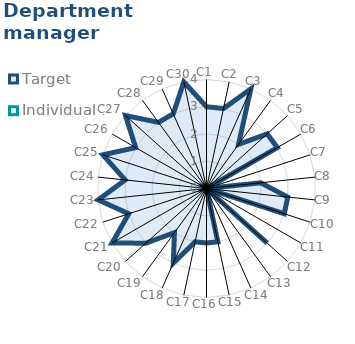
| Category | Target | Individual 1 |
|---|---|---|
| C1 | 3 | 0 |
| C2 | 3 | 0 |
| C3 | 4 | 0 |
| C4 | 2 | 0 |
| C5 | 3 | 0 |
| C6 | 3 | 0 |
| C7 | 0 | 0 |
| C8 | 2 | 0 |
| C9 | 3 | 0 |
| C10 | 3 | 0 |
| C11 | 0 | 0 |
| C12 | 3 | 0 |
| C13 | 0 | 0 |
| C14 | 0 | 0 |
| C15 | 2 | 0 |
| C16 | 2 | 0 |
| C17 | 2 | 0 |
| C18 | 3 | 0 |
| C19 | 2 | 0 |
| C20 | 3 | 0 |
| C21 | 4 | 0 |
| C22 | 3 | 0 |
| C23 | 4 | 0 |
| C24 | 3 | 0 |
| C25 | 4 | 0 |
| C26 | 3 | 0 |
| C27 | 4 | 0 |
| C28 | 3 | 0 |
| C29 | 3 | 0 |
| C30 | 4 | 0 |